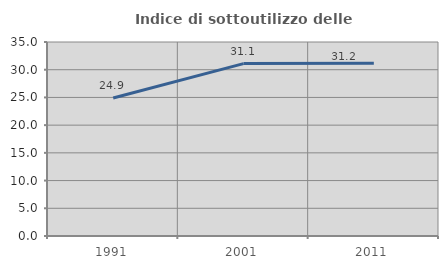
| Category | Indice di sottoutilizzo delle abitazioni  |
|---|---|
| 1991.0 | 24.897 |
| 2001.0 | 31.106 |
| 2011.0 | 31.162 |